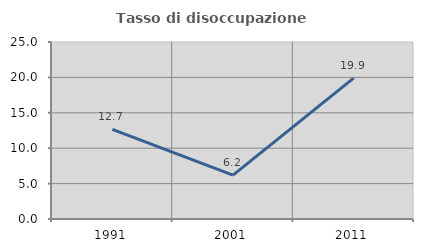
| Category | Tasso di disoccupazione giovanile  |
|---|---|
| 1991.0 | 12.652 |
| 2001.0 | 6.204 |
| 2011.0 | 19.898 |